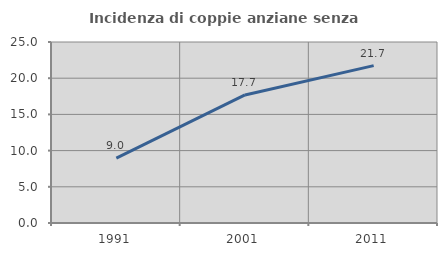
| Category | Incidenza di coppie anziane senza figli  |
|---|---|
| 1991.0 | 8.97 |
| 2001.0 | 17.69 |
| 2011.0 | 21.739 |